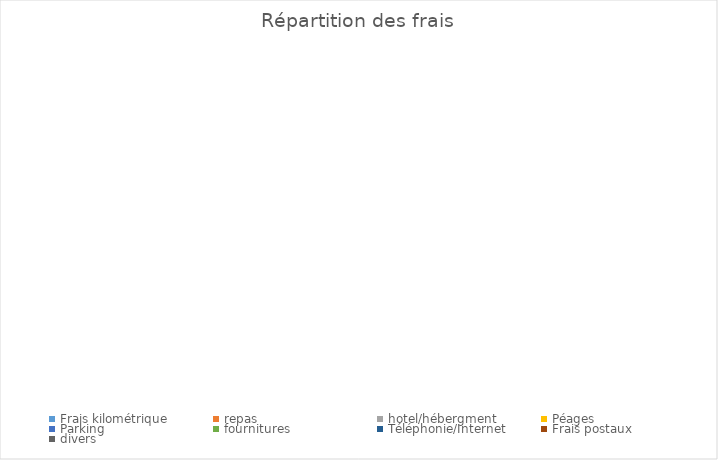
| Category | Series 0 |
|---|---|
| Frais kilométrique | 0 |
| repas | 0 |
| hotel/hébergment | 0 |
| Péages | 0 |
| Parking | 0 |
| fournitures | 0 |
| Téléphonie/Internet | 0 |
| Frais postaux | 0 |
| divers | 0 |